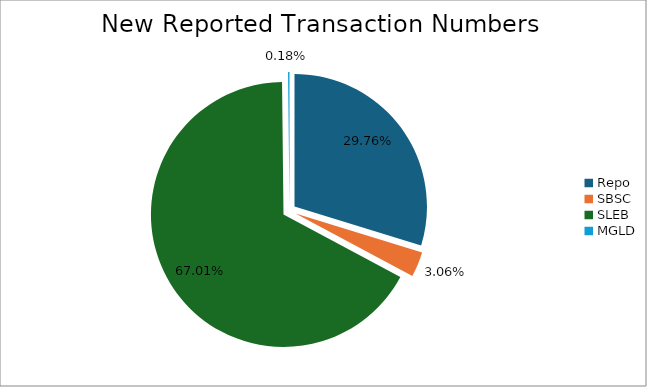
| Category | Series 0 |
|---|---|
| Repo | 424747 |
| SBSC | 43658 |
| SLEB | 956486 |
| MGLD | 2515 |